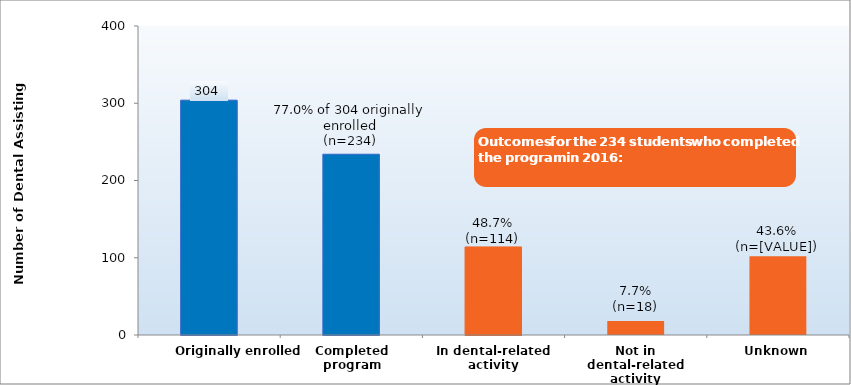
| Category | Series 0 |
|---|---|
| Originally enrolled | 304 |
| Completed program | 234 |
| In dental-related activity | 114 |
| Not in dental-related activity | 18 |
| Unknown | 102 |